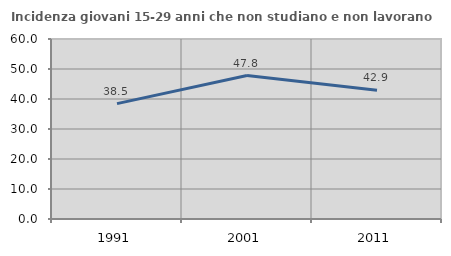
| Category | Incidenza giovani 15-29 anni che non studiano e non lavorano  |
|---|---|
| 1991.0 | 38.462 |
| 2001.0 | 47.82 |
| 2011.0 | 42.884 |